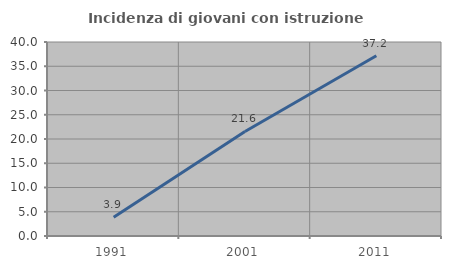
| Category | Incidenza di giovani con istruzione universitaria |
|---|---|
| 1991.0 | 3.883 |
| 2001.0 | 21.552 |
| 2011.0 | 37.179 |